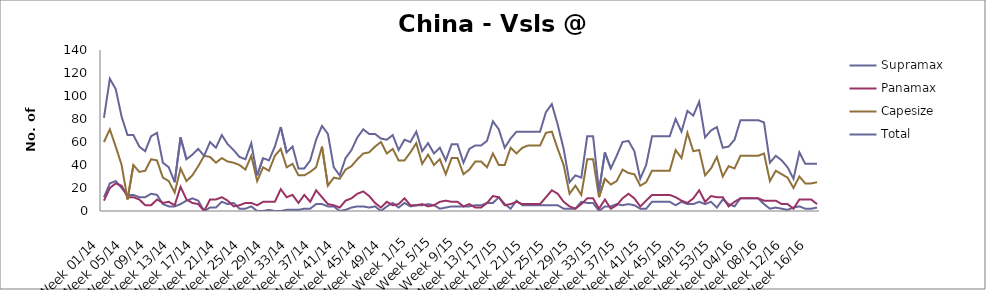
| Category | Supramax | Panamax | Capesize | Total |
|---|---|---|---|---|
| Week 01/14 | 12 | 9 | 60 | 81 |
| Week 02/14 | 24 | 20 | 71 | 115 |
| Week 03/14 | 26 | 24 | 56 | 106 |
| Week 04/14 | 20 | 22 | 40 | 82 |
| Week 05/14 | 14 | 12 | 10 | 66 |
| Week 06/14 | 14 | 12 | 40 | 66 |
| Week 07/14 | 12 | 10 | 34 | 56 |
| Week 08/14 | 12 | 5 | 35 | 52 |
| Week 09/14 | 15 | 5 | 45 | 65 |
| Week 10/14 | 14 | 10 | 44 | 68 |
| Week 11/14 | 6 | 7 | 29 | 42 |
| Week 12/14 | 4 | 8 | 26 | 38 |
| Week 13/14 | 4 | 5 | 16 | 25 |
| Week 14/14 | 6 | 21 | 37 | 64 |
| Week 15/14 | 9 | 10 | 26 | 45 |
| Week 16/14 | 11 | 7 | 31 | 49 |
| Week 17/14 | 9 | 6 | 39 | 54 |
| Week 18/14 | 0 | 0 | 48 | 48 |
| Week 19/14 | 3 | 10 | 47 | 60 |
| Week 20/14 | 3 | 10 | 42 | 55 |
| Week 21/14 | 8 | 12 | 46 | 66 |
| Week 22/14 | 6 | 9 | 43 | 58 |
| Week 23/14 | 7 | 4 | 42 | 53 |
| Week 24/14 | 2 | 5 | 40 | 47 |
| Week 25/14 | 2 | 7 | 36 | 45 |
| Week 26/14 | 4 | 7 | 48 | 59 |
| Week 27/14 | 0 | 5 | 26 | 31 |
| Week 28/14 | 0 | 8 | 38 | 46 |
| Week 29/14 | 1 | 8 | 35 | 44 |
| Week 30/14 | 0 | 8 | 48 | 56 |
| Week 31/14 | 0 | 19 | 54 | 73 |
| Week 32/14 | 1 | 12 | 38 | 51 |
| Week 33/14 | 1 | 14 | 41 | 56 |
| Week 34/14 | 1 | 7 | 31 | 37 |
| Week 35/14 | 2 | 14 | 31 | 37 |
| Week 36/14 | 2 | 8 | 34 | 44 |
| Week 37/14 | 6 | 18 | 38 | 62 |
| Week 38/14 | 6 | 12 | 56 | 74 |
| Week 39/14 | 4 | 6 | 22 | 67 |
| Week 40/14 | 4 | 5 | 29 | 38 |
| Week 41/14 | 0 | 3 | 28 | 31 |
| Week 42/14 | 1 | 9 | 36 | 46 |
| Week 43/14 | 3 | 11 | 39 | 53 |
| Week 44/14 | 4 | 15 | 45 | 64 |
| Week 45/14 | 4 | 17 | 50 | 71 |
| Week 46/14 | 3 | 13 | 51 | 67 |
| Week 47/14 | 4 | 7 | 56 | 67 |
| Week 48/14 | 0 | 3 | 60 | 63 |
| Week 49/14 | 4 | 8 | 50 | 62 |
| Week 50/14 | 7 | 5 | 54 | 66 |
| Week 51/14 | 3 | 6 | 44 | 53 |
| Week 52/14 | 7 | 11 | 44 | 62 |
| Week 1/15 | 4 | 5 | 51 | 60 |
| Week 2/15 | 5 | 5 | 59 | 69 |
| Week 3/15 | 5 | 6 | 41 | 52 |
| Week 4/15 | 6 | 4 | 49 | 59 |
| Week 5/15 | 5 | 5 | 40 | 50 |
| Week 6/15 | 2 | 8 | 45 | 55 |
| Week 7/15 | 3 | 9 | 32 | 44 |
| Week 8/15 | 4 | 8 | 46 | 58 |
| Week 9/15 | 4 | 8 | 46 | 58 |
| Week 10/15 | 4 | 4 | 32 | 42 |
| Week 11/15 | 4 | 6 | 36 | 54 |
| Week 12/15 | 5 | 3 | 43 | 57 |
| Week 13/15 | 5 | 3 | 43 | 57 |
| Week 14/15 | 7 | 7 | 38 | 61 |
| Week 15/15 | 7 | 13 | 50 | 78 |
| Week 16/15 | 12 | 12 | 40 | 71 |
| Week 17/15 | 6 | 5 | 40 | 55 |
| Week 18/15 | 2 | 6 | 55 | 63 |
| Week 19/15 | 9 | 8 | 50 | 69 |
| Week 20/15 | 5 | 6 | 55 | 69 |
| Week 21/15 | 5 | 6 | 57 | 69 |
| Week 22/15 | 5 | 6 | 57 | 69 |
| Week 23/15 | 5 | 6 | 57 | 69 |
| Week 24/15 | 5 | 12 | 68 | 86 |
| Week 25/15 | 5 | 18 | 69 | 93 |
| Week 26/15 | 5 | 15 | 54 | 75 |
| Week 27/15 | 2 | 8 | 40 | 54 |
| Week 28/15 | 2 | 4 | 15 | 25 |
| Week 29/15 | 2 | 2 | 22 | 31 |
| Week 30/15 | 8 | 6 | 14 | 29 |
| Week 31/15 | 7 | 11 | 45 | 65 |
| Week 32/15 | 7 | 11 | 45 | 65 |
| Week 33/15 | 0 | 2 | 12 | 17 |
| Week 34/15 | 4 | 10 | 28 | 51 |
| Week 35/15 | 4 | 2 | 23 | 37 |
| Week 36/15 | 6 | 5 | 26 | 48 |
| Week 37/15 | 5 | 11 | 36 | 60 |
| Week 38/15 | 6 | 15 | 33 | 61 |
| Week 39/15 | 5 | 11 | 32 | 52 |
| Week 40/15 | 2 | 4 | 22 | 28 |
| Week 41/15 | 2 | 9 | 25 | 40 |
| Week 42/15 | 8 | 14 | 35 | 65 |
| Week 43/15 | 8 | 14 | 35 | 65 |
| Week 44/15 | 8 | 14 | 35 | 65 |
| Week 45/15 | 8 | 14 | 35 | 65 |
| Week 46/15 | 5 | 12 | 53 | 80 |
| Week 47/15 | 8 | 9 | 46 | 69 |
| Week 48/15 | 6 | 7 | 68 | 87 |
| Week 49/15 | 6 | 11 | 52 | 83 |
| Week 50/15 | 8 | 18 | 53 | 95 |
| Week 51/15 | 6 | 8 | 31 | 64 |
| Week 52/15 | 8 | 13 | 37 | 70 |
| Week 53/15 | 3 | 12 | 47 | 73 |
| Week 01/16 | 10 | 12 | 30 | 55 |
| Week 02/16 | 6 | 4 | 39 | 56 |
| Week 03/16 | 4 | 8 | 37 | 62 |
| Week 04/16 | 11 | 11 | 48 | 79 |
| Week 05/16 | 11 | 11 | 48 | 79 |
| Week 06/16 | 11 | 11 | 48 | 79 |
| Week 07/16 | 11 | 11 | 48 | 79 |
| Week 08/16 | 6 | 9 | 50 | 77 |
| Week 09/16 | 2 | 9 | 26 | 42 |
| Week 10/16 | 3 | 9 | 35 | 48 |
| Week 11/16 | 2 | 6 | 32 | 44 |
| Week 12/16 | 1 | 6 | 29 | 38 |
| Week 13/16 | 3 | 2 | 20 | 28 |
| Week 14/16 | 4 | 10 | 30 | 51 |
| Week 15/16 | 2 | 10 | 24 | 41 |
| Week 16/16 | 2 | 10 | 24 | 41 |
| Week 17/16 | 3 | 6 | 25 | 41 |